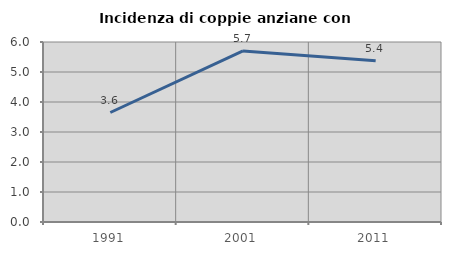
| Category | Incidenza di coppie anziane con figli |
|---|---|
| 1991.0 | 3.65 |
| 2001.0 | 5.702 |
| 2011.0 | 5.375 |